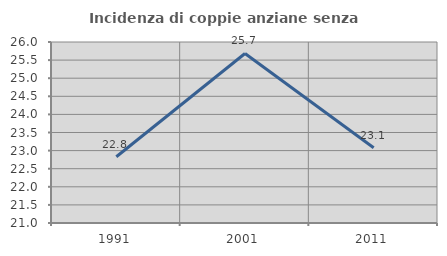
| Category | Incidenza di coppie anziane senza figli  |
|---|---|
| 1991.0 | 22.831 |
| 2001.0 | 25.683 |
| 2011.0 | 23.077 |